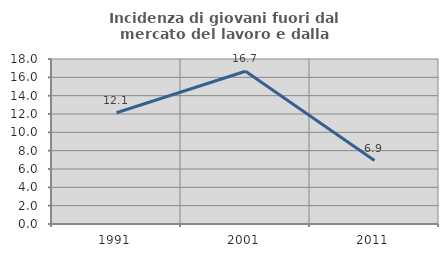
| Category | Incidenza di giovani fuori dal mercato del lavoro e dalla formazione  |
|---|---|
| 1991.0 | 12.136 |
| 2001.0 | 16.667 |
| 2011.0 | 6.926 |